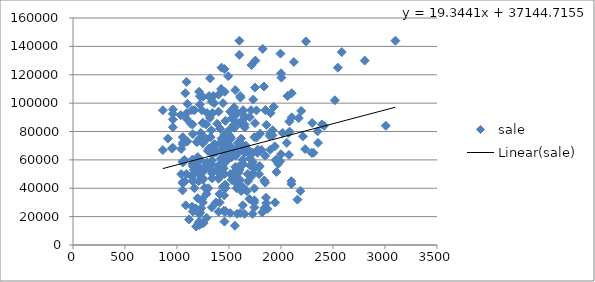
| Category | sale |
|---|---|
| 1320.0 | 56500 |
| 1152.0 | 23601 |
| 1456.0 | 78000 |
| 1672.0 | 38000 |
| 1212.0 | 22000 |
| 1918.0 | 77300 |
| 1357.0 | 100000 |
| 1184.0 | 13000 |
| 2083.0 | 79900 |
| 1492.0 | 119000 |
| 2077.0 | 63500 |
| 960.0 | 88500 |
| 1764.0 | 94900 |
| 1820.0 | 23000 |
| 1742.0 | 30000 |
| 1492.0 | 65750 |
| 864.0 | 66900 |
| 1162.0 | 53000 |
| 1280.0 | 85000 |
| 1564.0 | 64310 |
| 1332.0 | 57000 |
| 1744.0 | 26500 |
| 1338.0 | 59600 |
| 1056.0 | 71000 |
| 1851.0 | 95000 |
| 1851.0 | 95000 |
| 1958.0 | 60000 |
| 1328.0 | 92000 |
| 912.0 | 75000 |
| 1290.0 | 93000 |
| 1056.0 | 58150 |
| 1256.0 | 15481 |
| 1410.0 | 30000 |
| 2080.0 | 87000 |
| 1436.0 | 67500 |
| 1436.0 | 66500 |
| 1036.0 | 91500 |
| 2158.0 | 32000 |
| 1155.0 | 50100 |
| 1232.0 | 26000 |
| 1092.0 | 92900 |
| 1368.0 | 70321 |
| 1440.0 | 53500 |
| 1076.0 | 44900 |
| 2232.0 | 67575 |
| 1566.0 | 49500 |
| 1240.0 | 15250 |
| 1056.0 | 44300 |
| 1056.0 | 59000 |
| 1579.0 | 92500 |
| 2124.0 | 129000 |
| 1054.0 | 38500 |
| 1524.0 | 65000 |
| 1896.0 | 67100 |
| 1092.0 | 89000 |
| 1859.0 | 29500 |
| 1216.0 | 50000 |
| 1650.0 | 85000 |
| 1460.0 | 58000 |
| 1632.0 | 28000 |
| 1562.0 | 52224 |
| 2000.0 | 121000 |
| 1228.0 | 25510 |
| 1764.0 | 75800 |
| 1638.0 | 57000 |
| 1336.0 | 50500 |
| 1795.0 | 55600 |
| 1482.0 | 75000 |
| 2584.0 | 136000 |
| 960.0 | 68503 |
| 1848.0 | 62900 |
| 1514.0 | 76000 |
| 1176.0 | 25900 |
| 1617.0 | 75000 |
| 1618.0 | 86000 |
| 1400.0 | 55150 |
| 1248.0 | 86000 |
| 1256.0 | 52000 |
| 1754.0 | 130000 |
| 1680.0 | 50000 |
| 1464.0 | 42500 |
| 1337.0 | 47000 |
| 1992.0 | 59100 |
| 1726.0 | 21945 |
| 1317.0 | 89500 |
| 1214.0 | 16500 |
| 1464.0 | 24000 |
| 1200.0 | 55500 |
| 1496.0 | 64000 |
| 1789.0 | 49900 |
| 1810.0 | 67000 |
| 1200.0 | 73000 |
| 1940.0 | 69500 |
| 1427.0 | 72900 |
| 2100.0 | 45000 |
| 1248.0 | 104500 |
| 1400.0 | 23500 |
| 2546.0 | 125000 |
| 1590.0 | 67840 |
| 1334.0 | 101000 |
| 1216.0 | 14125 |
| 1744.0 | 76000 |
| 1848.0 | 44000 |
| 1456.0 | 50000 |
| 2414.0 | 84000 |
| 1744.0 | 39900 |
| 1736.0 | 55500 |
| 1636.0 | 39676 |
| 1500.0 | 81000 |
| 1712.0 | 95000 |
| 1776.0 | 67200 |
| 1248.0 | 71877 |
| 1144.0 | 95100 |
| 960.0 | 92500 |
| 1301.0 | 40000 |
| 1502.0 | 77400 |
| 1956.0 | 51500 |
| 1560.0 | 55000 |
| 1283.0 | 36000 |
| 1553.0 | 82600 |
| 2312.0 | 65000 |
| 1650.0 | 65000 |
| 1326.0 | 103500 |
| 1900.0 | 93000 |
| 1712.0 | 48000 |
| 1651.0 | 82800 |
| 1424.0 | 110000 |
| 1702.0 | 61000 |
| 1594.0 | 55375 |
| 1632.0 | 41000 |
| 1420.0 | 71400 |
| 1560.0 | 87000 |
| 1296.0 | 66400 |
| 1585.0 | 71877 |
| 1428.0 | 75000 |
| 1308.0 | 105000 |
| 1090.0 | 50000 |
| 1173.0 | 25000 |
| 1200.0 | 62000 |
| 1144.0 | 48000 |
| 2240.0 | 143500 |
| 2170.0 | 89400 |
| 960.0 | 95500 |
| 2518.0 | 102000 |
| 1648.0 | 89500 |
| 1330.0 | 80900 |
| 1860.0 | 84694 |
| 1944.0 | 30000 |
| 1208.0 | 45000 |
| 1248.0 | 53000 |
| 1420.0 | 61000 |
| 1522.0 | 61650 |
| 1248.0 | 86000 |
| 1290.0 | 58194 |
| 1467.0 | 63500 |
| 1408.0 | 36000 |
| 1306.0 | 68000 |
| 1536.0 | 66900 |
| 1386.0 | 85500 |
| 1698.0 | 66000 |
| 1470.0 | 58900 |
| 1134.0 | 85400 |
| 1649.0 | 22000 |
| 1100.0 | 73000 |
| 1400.0 | 94000 |
| 1215.0 | 22000 |
| 1084.0 | 28000 |
| 1342.0 | 93000 |
| 1552.0 | 95000 |
| 1144.0 | 27000 |
| 1746.0 | 54000 |
| 1840.0 | 26000 |
| 1598.0 | 53000 |
| 1488.0 | 70000 |
| 1100.0 | 99500 |
| 1428.0 | 125000 |
| 2103.0 | 90000 |
| 1744.0 | 31500 |
| 1237.0 | 47000 |
| 1323.0 | 76000 |
| 1750.0 | 85900 |
| 1726.0 | 50000 |
| 1465.0 | 87500 |
| 1456.0 | 124000 |
| 864.0 | 95000 |
| 2296.0 | 64900 |
| 1414.0 | 82127 |
| 1374.0 | 65400 |
| 1870.0 | 25500 |
| 1248.0 | 46000 |
| 1308.0 | 55000 |
| 1148.0 | 57000 |
| 1555.0 | 45000 |
| 1250.0 | 47000 |
| 1604.0 | 46000 |
| 1360.0 | 68000 |
| 1774.0 | 65000 |
| 1040.0 | 49950 |
| 1072.0 | 59900 |
| 1040.0 | 67700 |
| 1360.0 | 71000 |
| 1700.0 | 90100 |
| 1930.0 | 97400 |
| 2016.0 | 78970 |
| 1228.0 | 79000 |
| 1512.0 | 50000 |
| 1530.0 | 89570 |
| 1578.0 | 22000 |
| 1896.0 | 78900 |
| 1717.0 | 64890 |
| 1223.0 | 60000 |
| 1187.0 | 24900 |
| 1283.0 | 74500 |
| 1484.0 | 61607 |
| 1600.0 | 144000 |
| 1216.0 | 51250 |
| 1592.0 | 51000 |
| 1662.0 | 70000 |
| 1152.0 | 45143 |
| 1632.0 | 68700 |
| 1584.0 | 65000 |
| 1318.0 | 117500 |
| 1328.0 | 64700 |
| 1149.0 | 85000 |
| 2103.0 | 107000 |
| 1284.0 | 19200 |
| 1416.0 | 54000 |
| 1480.0 | 63500 |
| 1412.0 | 57000 |
| 1696.0 | 32500 |
| 1056.0 | 76000 |
| 1636.0 | 95000 |
| 1491.0 | 67500 |
| 1239.0 | 32140 |
| 1454.0 | 35000 |
| 1556.0 | 46000 |
| 2070.0 | 78900 |
| 2063.0 | 105000 |
| 2805.0 | 130000 |
| 1116.0 | 18000 |
| 2100.0 | 43000 |
| 1730.0 | 58500 |
| 1353.0 | 65000 |
| 2056.0 | 72000 |
| 1562.0 | 44000 |
| 1374.0 | 30000 |
| 1282.0 | 57000 |
| 1352.0 | 70000 |
| 1948.0 | 59790 |
| 1268.0 | 40280 |
| 1149.0 | 60250 |
| 1536.0 | 92500 |
| 1706.0 | 55900 |
| 1750.0 | 111000 |
| 950.0 | 68040 |
| 2356.0 | 72000 |
| 1617.0 | 38050 |
| 2300.0 | 86000 |
| 1334.0 | 26500 |
| 1250.0 | 72000 |
| 1404.0 | 47594 |
| 1510.0 | 69900 |
| 2352.0 | 80103 |
| 1220.0 | 99000 |
| 1608.0 | 105000 |
| 1168.0 | 40000 |
| 1216.0 | 75000 |
| 1836.0 | 111750 |
| 1080.0 | 107000 |
| 1400.0 | 106000 |
| 1824.0 | 138200 |
| 1920.0 | 80855 |
| 1460.0 | 64720 |
| 1447.0 | 54000 |
| 1056.0 | 72000 |
| 1400.0 | 46700 |
| 2186.0 | 38103 |
| 1602.0 | 42100 |
| 1222.0 | 23000 |
| 1466.0 | 40150 |
| 1600.0 | 53000 |
| 1560.0 | 109180 |
| 1152.0 | 55500 |
| 1578.0 | 53000 |
| 1730.0 | 55000 |
| 2211.0 | 76593 |
| 1560.0 | 67000 |
| 1440.0 | 55000 |
| 1056.0 | 43500 |
| 1152.0 | 78200 |
| 1704.0 | 63500 |
| 1442.0 | 100000 |
| 1448.0 | 24000 |
| 1205.0 | 59550 |
| 1212.0 | 108000 |
| 2000.0 | 64000 |
| 1492.0 | 67000 |
| 1608.0 | 22500 |
| 1520.0 | 75000 |
| 3008.0 | 84000 |
| 1733.0 | 102500 |
| 960.0 | 83000 |
| 1248.0 | 30000 |
| 1344.0 | 51900 |
| 1620.0 | 71200 |
| 1168.0 | 95000 |
| 3100.0 | 144000 |
| 1456.0 | 16500 |
| 1458.0 | 108000 |
| 2194.0 | 94500 |
| 1557.0 | 13600 |
| 1248.0 | 77000 |
| 1600.0 | 86000 |
| 1172.0 | 57750 |
| 1599.0 | 134000 |
| 1682.0 | 45000 |
| 1725.0 | 65000 |
| 2392.0 | 85000 |
| 1574.0 | 40000 |
| 1526.0 | 45900 |
| 1632.0 | 60000 |
| 1856.0 | 33321 |
| 1890.0 | 77000 |
| 1466.0 | 75000 |
| 2004.0 | 118000 |
| 1995.0 | 134900 |
| 1610.0 | 103900 |
| 1650.0 | 91000 |
| 1550.0 | 97000 |
| 1220.0 | 104900 |
| 1512.0 | 22500 |
| 1384.0 | 52200 |
| 1248.0 | 75000 |
| 1512.0 | 94000 |
| 1350.0 | 105000 |
| 1800.0 | 78500 |
| 1464.0 | 23500 |
| 1716.0 | 126800 |
| 1440.0 | 41000 |
| 1839.0 | 45500 |
| 1545.0 | 84600 |
| 1198.0 | 33000 |
| 1152.0 | 45000 |
| 1973.0 | 57170 |
| 1788.0 | 55000 |
| 1092.0 | 115000 |
| 1206.0 | 15250 |
| 1190.0 | 72500 |
| 1239.0 | 95000 |
| 1568.0 | 63000 |